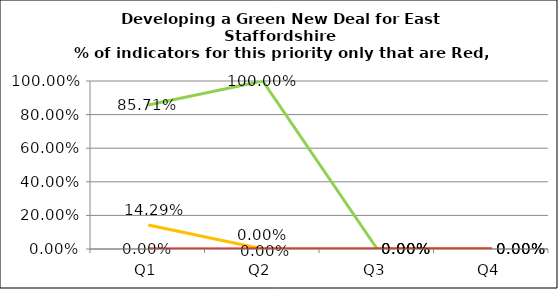
| Category | Green | Amber | Red |
|---|---|---|---|
| Q1 | 0.857 | 0.143 | 0 |
| Q2 | 1 | 0 | 0 |
| Q3 | 0 | 0 | 0 |
| Q4 | 0 | 0 | 0 |